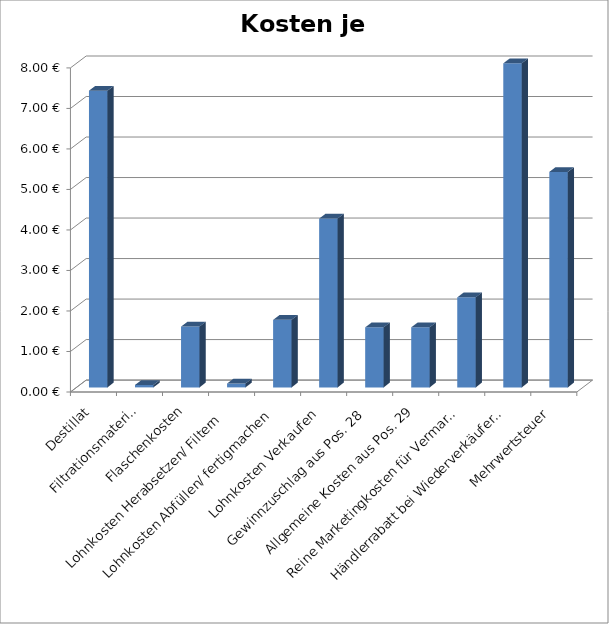
| Category | Kosten je Flasche |
|---|---|
| Destillat | 7.324 |
| Filtrationsmaterial | 0.06 |
| Flaschenkosten | 1.5 |
| Lohnkosten Herabsetzen/ Filtern  | 0.095 |
| Lohnkosten Abfüllen/ fertigmachen | 1.667 |
| Lohnkosten Verkaufen | 4.167 |
| Gewinnzuschlag aus Pos. 28 | 1.481 |
| Allgemeine Kosten aus Pos. 29 | 1.481 |
| Reine Marketingkosten für Vermarktung Pos.30 | 2.222 |
| Händlerrabatt bei Wiederverkäufer Pos 31 | 7.999 |
| Mehrwertsteuer | 5.319 |